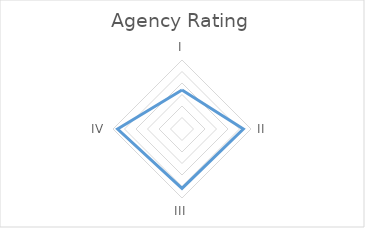
| Category | Series 0 |
|---|---|
| I | 1.692 |
| II | 2.667 |
| III | 2.583 |
| IV | 2.8 |